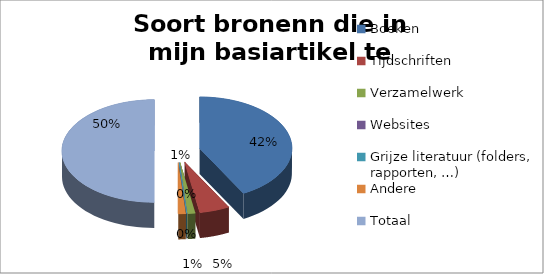
| Category | Procent |
|---|---|
| Boeken | 0.842 |
| Tijdschriften | 0.105 |
| Verzamelwerk | 0.026 |
| Websites | 0 |
| Grijze literatuur (folders, rapporten, …) | 0 |
| Andere | 0.026 |
| Totaal | 1 |